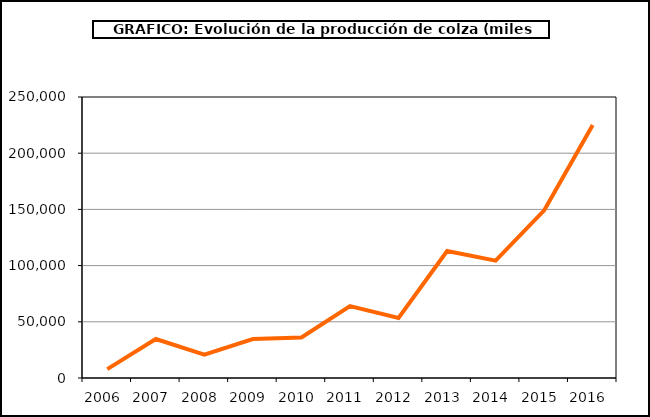
| Category | Producción |
|---|---|
| 2006.0 | 7926 |
| 2007.0 | 34700 |
| 2008.0 | 20816 |
| 2009.0 | 34663 |
| 2010.0 | 36029 |
| 2011.0 | 63902 |
| 2012.0 | 53447 |
| 2013.0 | 112928 |
| 2014.0 | 104361 |
| 2015.0 | 149198 |
| 2016.0 | 225165 |